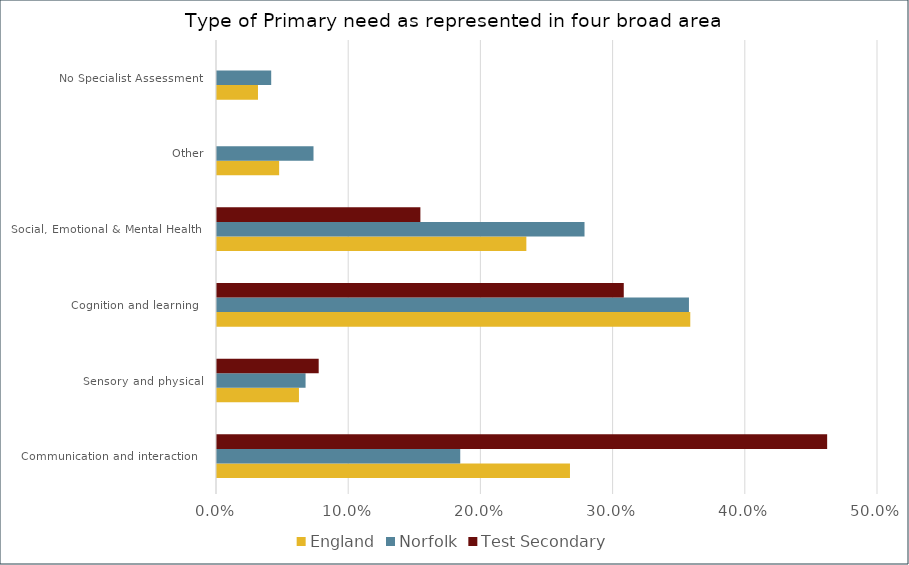
| Category | England | Norfolk | Test Secondary |
|---|---|---|---|
| Communication and interaction  | 0.267 | 0.184 | 0.462 |
| Sensory and physical | 0.062 | 0.067 | 0.077 |
| Cognition and learning  | 0.358 | 0.357 | 0.308 |
| Social, Emotional & Mental Health | 0.234 | 0.278 | 0.154 |
| Other | 0.047 | 0.073 | 0 |
| No Specialist Assessment | 0.031 | 0.041 | 0 |